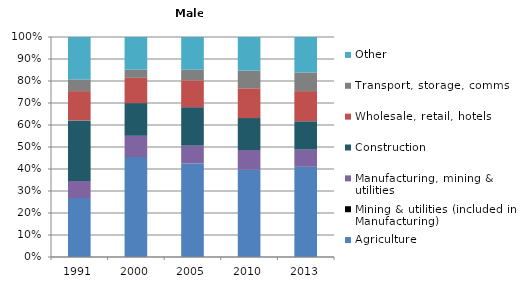
| Category | Agriculture | Mining & utilities (included in Manufacturing) | Manufacturing, mining & utilities | Construction | Wholesale, retail, hotels | Transport, storage, comms | Other |
|---|---|---|---|---|---|---|---|
| 1991.0 | 26.8 |  | 7.8 | 27.5 | 13.3 | 5.3 | 19.3 |
| 2000.0 | 45.5 |  | 9.7 | 14.9 | 11.5 | 3.7 | 14.9 |
| 2005.0 | 42.5 |  | 8.1 | 17.5 | 12.2 | 4.8 | 14.9 |
| 2010.0 | 39.6 |  | 9 | 14.5 | 13.5 | 8 | 15.3 |
| 2013.0 | 41 |  | 7.8 | 12.9 | 13.7 | 8.5 | 16.1 |